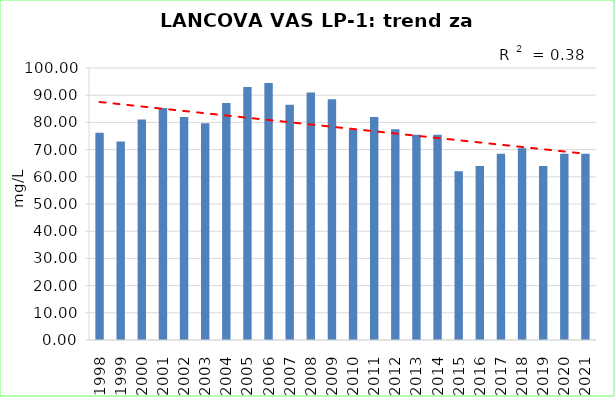
| Category | Vsota |
|---|---|
| 1998 | 76.2 |
| 1999 | 72.95 |
| 2000 | 81.1 |
| 2001 | 85.3 |
| 2002 | 81.95 |
| 2003 | 79.7 |
| 2004 | 87.1 |
| 2005 | 93 |
| 2006 | 94.5 |
| 2007 | 86.5 |
| 2008 | 91 |
| 2009 | 88.5 |
| 2010 | 77.5 |
| 2011 | 82 |
| 2012 | 77.5 |
| 2013 | 75.5 |
| 2014 | 75.5 |
| 2015 | 62 |
| 2016 | 64 |
| 2017 | 68.5 |
| 2018 | 70.5 |
| 2019 | 64 |
| 2020 | 68.5 |
| 2021 | 68.5 |